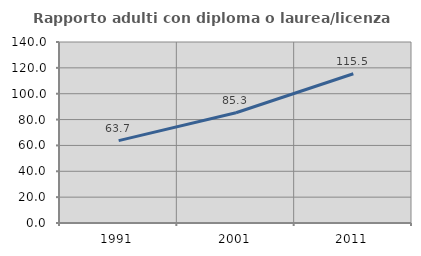
| Category | Rapporto adulti con diploma o laurea/licenza media  |
|---|---|
| 1991.0 | 63.684 |
| 2001.0 | 85.259 |
| 2011.0 | 115.472 |